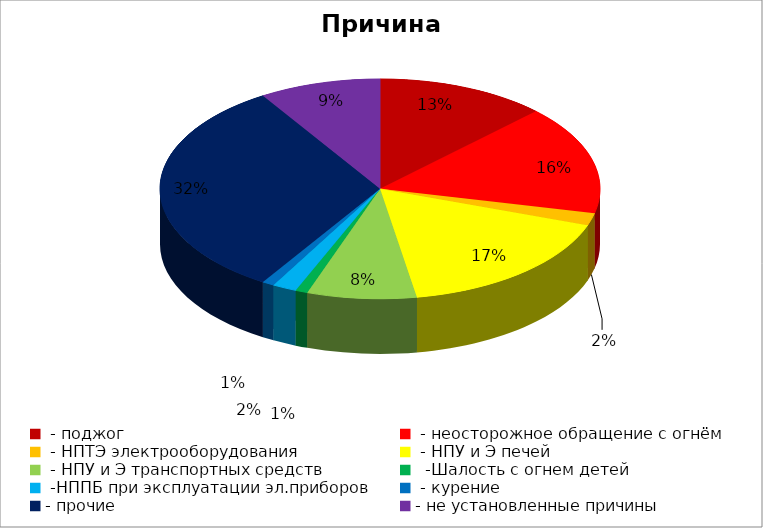
| Category | Причина пожара |
|---|---|
|  - поджог | 14 |
|  - неосторожное обращение с огнём | 18 |
|  - НПТЭ электрооборудования | 2 |
|  - НПУ и Э печей | 19 |
|  - НПУ и Э транспортных средств | 9 |
|   -Шалость с огнем детей | 1 |
|  -НППБ при эксплуатации эл.приборов | 2 |
|  - курение | 1 |
| - прочие | 36 |
| - не установленные причины | 10 |